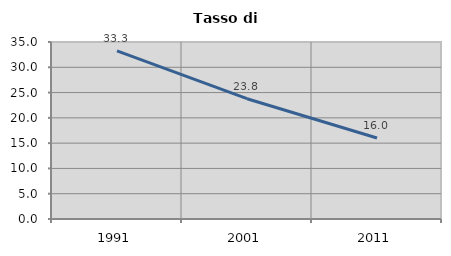
| Category | Tasso di disoccupazione   |
|---|---|
| 1991.0 | 33.254 |
| 2001.0 | 23.787 |
| 2011.0 | 16.021 |